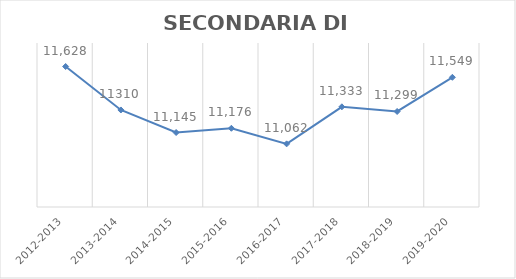
| Category | SECONDARIA DI 1°  |
|---|---|
| 2012-2013 | 11628 |
| 2013-2014 | 11310 |
| 2014-2015 | 11145 |
| 2015-2016 | 11176 |
| 2016-2017 | 11062 |
| 2017-2018 | 11333 |
| 2018-2019 | 11299 |
| 2019-2020 | 11549 |